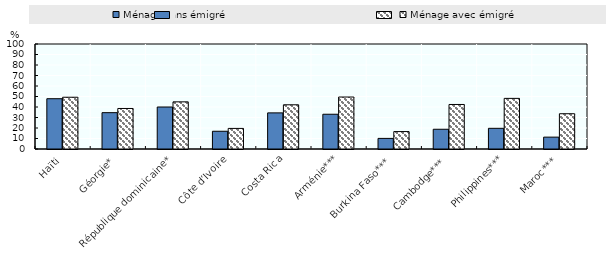
| Category | Ménage sans émigré | Ménage avec émigré |
|---|---|---|
| Haïti | 47.9 | 49.3 |
| Géorgie* | 34.6 | 38.6 |
| République dominicaine* | 40 | 44.9 |
| Côte d’Ivoire | 16.9 | 19.6 |
| Costa Rica | 34.4 | 42.1 |
| Arménie*** | 33.1 | 49.5 |
| Burkina Faso*** | 10.1 | 16.6 |
| Cambodge*** | 18.8 | 42.4 |
| Philippines*** | 19.7 | 48.2 |
| Maroc*** | 11.3 | 33.6 |